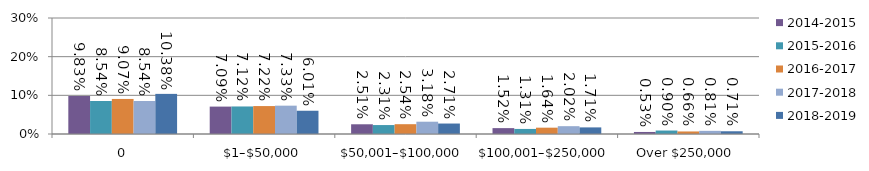
| Category | 2014-2015 | 2015-2016 | 2016-2017 | 2017-2018 | 2018-2019 |
|---|---|---|---|---|---|
| 0 | 0.098 | 0.085 | 0.091 | 0.085 | 0.104 |
| $1–$50,000 | 0.071 | 0.071 | 0.072 | 0.073 | 0.06 |
| $50,001–$100,000 | 0.025 | 0.023 | 0.025 | 0.032 | 0.027 |
| $100,001–$250,000 | 0.015 | 0.013 | 0.016 | 0.02 | 0.017 |
| Over $250,000 | 0.005 | 0.009 | 0.007 | 0.008 | 0.007 |